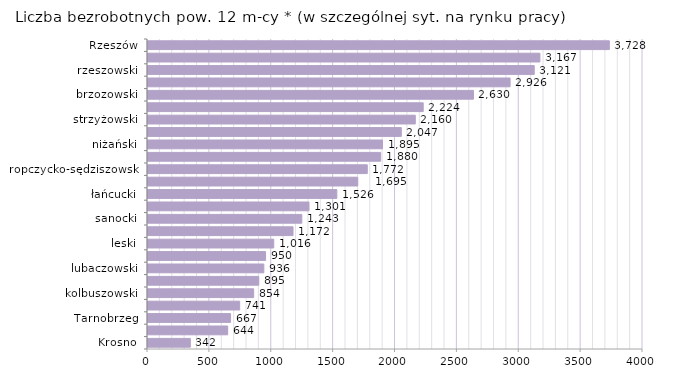
| Category | Liczba bezrobotnych powyżej 12 miesięcy* - w szczególnej sytuacji na rynku pracy |
|---|---|
| Krosno | 342 |
| bieszczadzki | 644 |
| Tarnobrzeg | 667 |
| tarnobrzeski  | 741 |
| kolbuszowski | 854 |
| stalowowolski | 895 |
| lubaczowski | 936 |
| krośnieński | 950 |
| leski | 1016 |
| dębicki | 1172 |
| sanocki | 1243 |
| mielecki | 1301 |
| łańcucki | 1526 |
| Przemyśl | 1695 |
| ropczycko-sędziszowski | 1772 |
| przemyski | 1880 |
| niżański | 1895 |
| leżajski | 2047 |
| strzyżowski | 2160 |
| przeworski | 2224 |
| brzozowski | 2630 |
| jarosławski | 2926 |
| rzeszowski | 3121 |
| jasielski | 3167 |
| Rzeszów | 3728 |